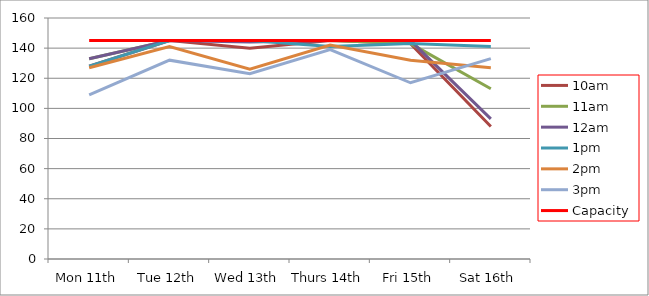
| Category | 9am | 10am | 11am | 12am | 1pm | 2pm | 3pm | 4pm | 5pm | Capacity |
|---|---|---|---|---|---|---|---|---|---|---|
| Mon 11th |  | 128 | 133 | 133 | 128 | 127 | 109 |  |  | 145 |
| Tue 12th |  | 145 | 145 | 145 | 145 | 141 | 132 |  |  | 145 |
| Wed 13th |  | 140 | 145 | 144 | 145 | 126 | 123 |  |  | 145 |
| Thurs 14th |  | 145 | 145 | 145 | 141 | 142 | 139 |  |  | 145 |
| Fri 15th |  | 143 | 143 | 145 | 143 | 132 | 117 |  |  | 145 |
| Sat 16th |  | 88 | 113 | 93 | 141 | 127 | 133 |  |  | 145 |